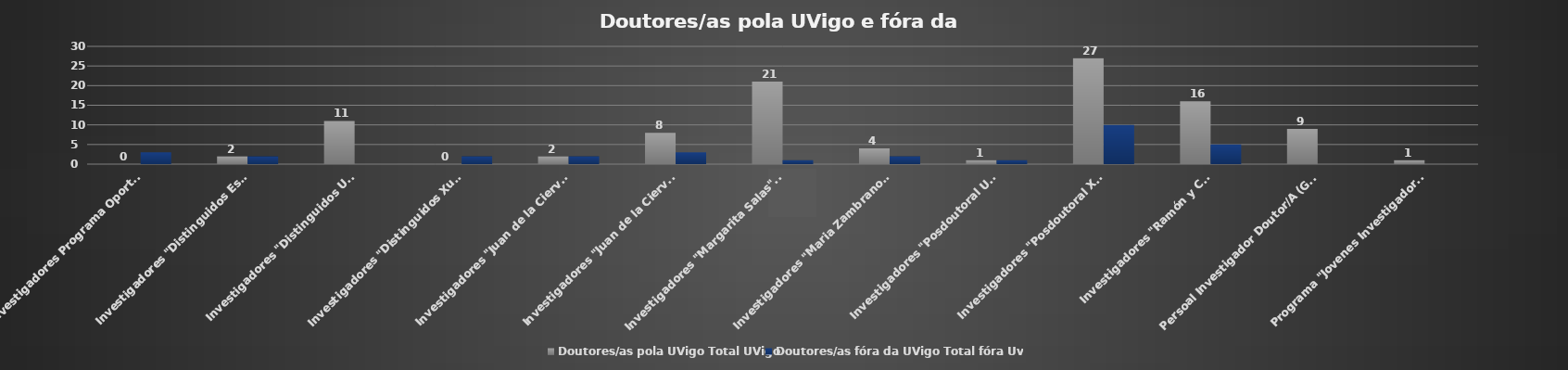
| Category | Doutores/as pola UVigo | Doutores/as fóra da UVigo |
|---|---|---|
| Investigadores Programa Oportunius | 0 | 3 |
| Investigadores "Distinguidos Estado" | 2 | 2 |
| Investigadores "Distinguidos UVigo" | 11 | 0 |
| Investigadores "Distinguidos Xunta de Galicia" | 0 | 2 |
| Investigadores "Juan de la Cierva-Formación" | 2 | 2 |
| Investigadores "Juan de la Cierva-Incorporación" | 8 | 3 |
| Investigadores "Margarita Salas". (Grupo I) | 21 | 1 |
| Investigadores "Maria Zambrano". (Grupo I) | 4 | 2 |
| Investigadores "Posdoutoral UVigo" | 1 | 1 |
| Investigadores "Posdoutoral Xunta" | 27 | 10 |
| Investigadores "Ramón y Cajal" | 16 | 5 |
| Persoal Investigador Doutor/A (Grupo I) | 9 | 0 |
| Programa "Jovenes Investigadores". Grupo I | 1 | 0 |